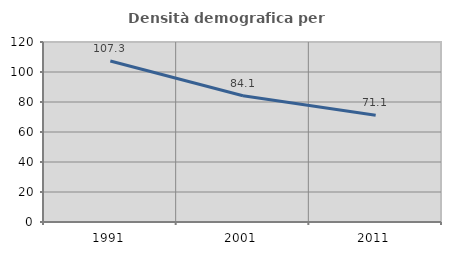
| Category | Densità demografica |
|---|---|
| 1991.0 | 107.288 |
| 2001.0 | 84.122 |
| 2011.0 | 71.138 |